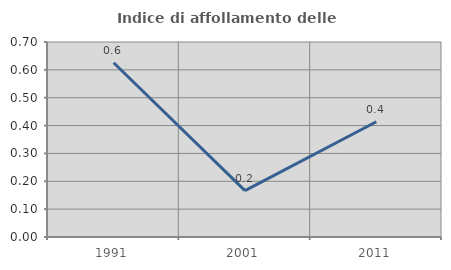
| Category | Indice di affollamento delle abitazioni  |
|---|---|
| 1991.0 | 0.626 |
| 2001.0 | 0.167 |
| 2011.0 | 0.414 |